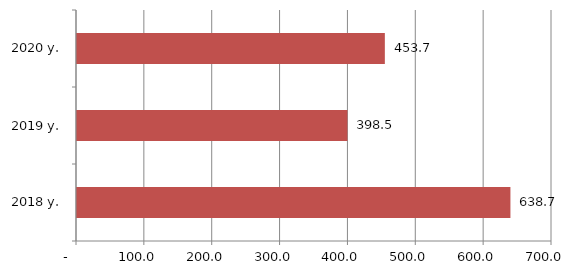
| Category | Series 0 |
|---|---|
| 2018 y. | 638.722 |
| 2019 y. | 398.494 |
| 2020 y. | 453.675 |